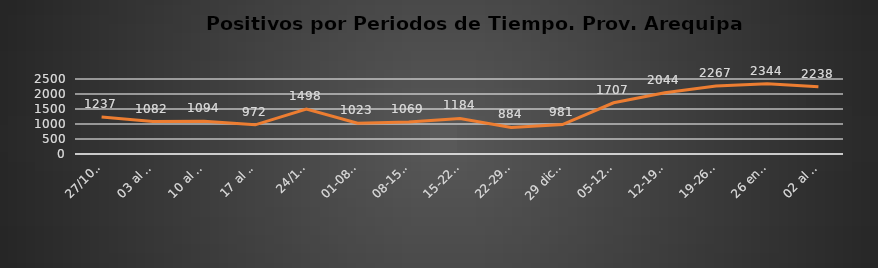
| Category | Prov. Arequipa  |
|---|---|
| 27/10 al 03/11/ | 1237 |
| 03 al 10/11 | 1082 |
| 10 al 17/11/ | 1094 |
|  17 al 24/11/ | 972 |
|  24/11 al 01/12/ | 1498 |
| 01-08 dic. | 1023 |
| 08-15 dic. | 1069 |
| 15-22 dic | 1184 |
| 22-29 dic | 884 |
| 29 dic-05/ene | 981 |
| 05-12 ene | 1707 |
| 12-19 ene | 2044 |
| 19-26 ene | 2267 |
| 26 ene -02 feb | 2344 |
| 02 al 09 feb | 2238 |